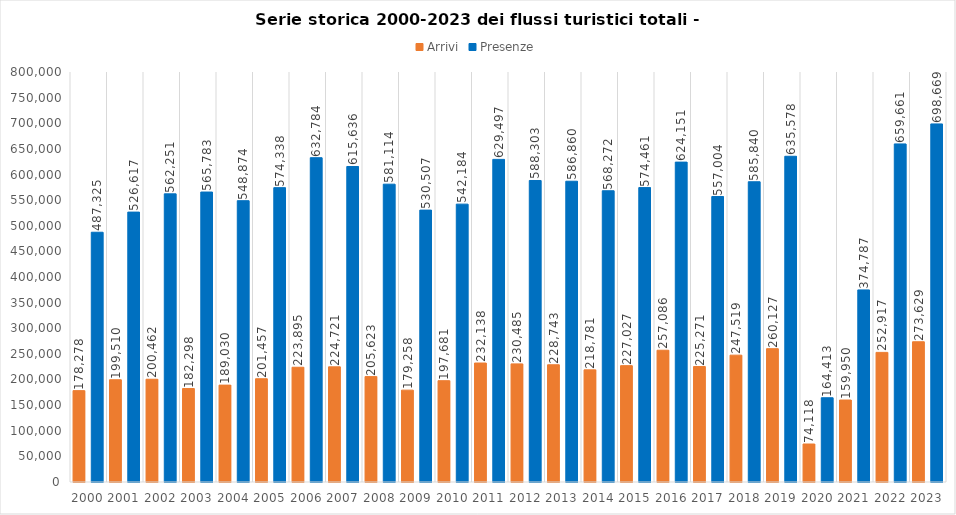
| Category | Arrivi | Presenze |
|---|---|---|
| 2000.0 | 178278 | 487325 |
| 2001.0 | 199510 | 526617 |
| 2002.0 | 200462 | 562251 |
| 2003.0 | 182298 | 565783 |
| 2004.0 | 189030 | 548874 |
| 2005.0 | 201457 | 574338 |
| 2006.0 | 223895 | 632784 |
| 2007.0 | 224721 | 615636 |
| 2008.0 | 205623 | 581114 |
| 2009.0 | 179258 | 530507 |
| 2010.0 | 197681 | 542184 |
| 2011.0 | 232138 | 629497 |
| 2012.0 | 230485 | 588303 |
| 2013.0 | 228743 | 586860 |
| 2014.0 | 218781 | 568272 |
| 2015.0 | 227027 | 574461 |
| 2016.0 | 257086 | 624151 |
| 2017.0 | 225271 | 557004 |
| 2018.0 | 247519 | 585840 |
| 2019.0 | 260127 | 635578 |
| 2020.0 | 74118 | 164413 |
| 2021.0 | 159950 | 374787 |
| 2022.0 | 252917 | 659661 |
| 2023.0 | 273629 | 698669 |